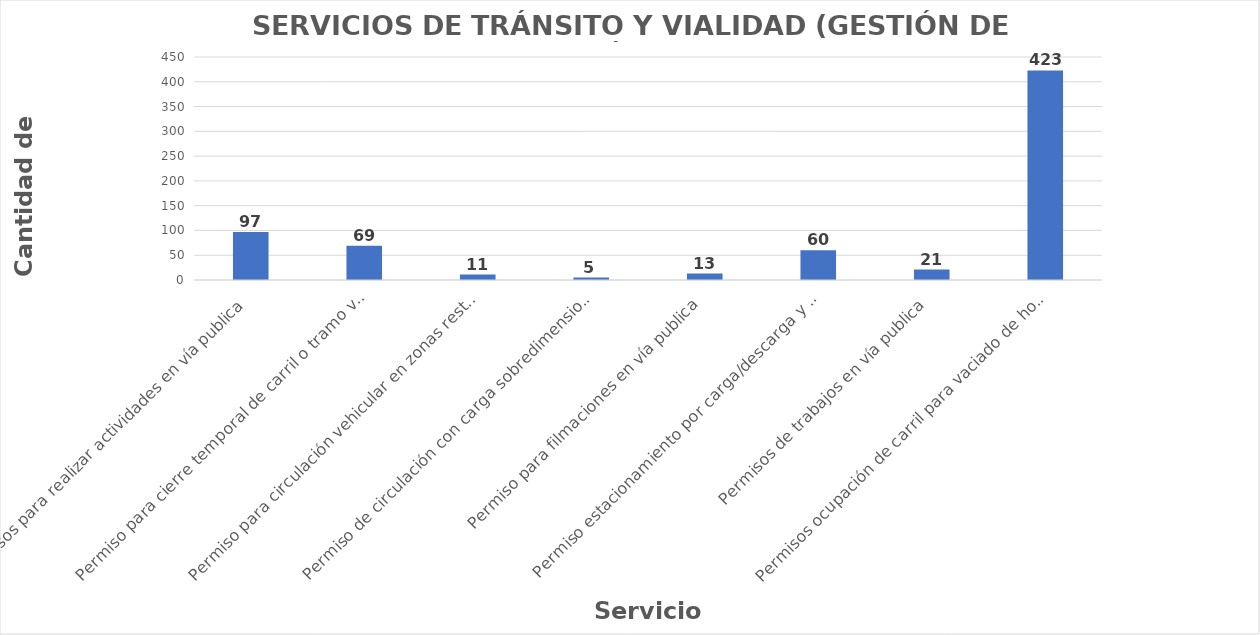
| Category | Series 0 |
|---|---|
| Permisos para realizar actividades en vía publica | 97 |
| Permiso para cierre temporal de carril o tramo vial | 69 |
| Permiso para circulación vehicular en zonas restringidas | 11 |
| Permiso de circulación con carga sobredimensionada | 5 |
| Permiso para filmaciones en vía publica | 13 |
| Permiso estacionamiento por carga/descarga y otros | 60 |
| Permisos de trabajos en vía publica | 21 |
| Permisos ocupación de carril para vaciado de hormigón | 423 |